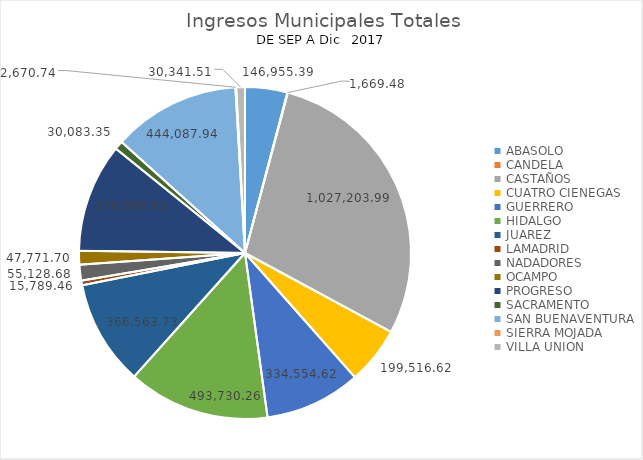
| Category | Series 0 |
|---|---|
| ABASOLO | 146955.39 |
| CANDELA | 1669.48 |
| CASTAÑOS | 1027203.99 |
| CUATRO CIENEGAS | 199516.62 |
| GUERRERO | 334554.62 |
| HIDALGO | 493730.26 |
| JUAREZ | 366563.73 |
| LAMADRID | 15789.46 |
| NADADORES | 55128.68 |
| OCAMPO | 47771.7 |
| PROGRESO | 378998.93 |
| SACRAMENTO | 30083.35 |
| SAN BUENAVENTURA | 444087.94 |
| SIERRA MOJADA | 2670.74 |
| VILLA UNION | 30341.51 |